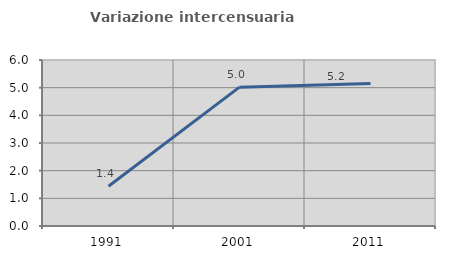
| Category | Variazione intercensuaria annua |
|---|---|
| 1991.0 | 1.436 |
| 2001.0 | 5.019 |
| 2011.0 | 5.152 |